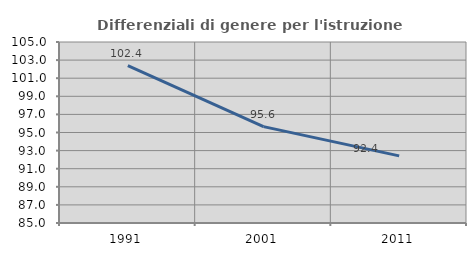
| Category | Differenziali di genere per l'istruzione superiore |
|---|---|
| 1991.0 | 102.381 |
| 2001.0 | 95.647 |
| 2011.0 | 92.415 |